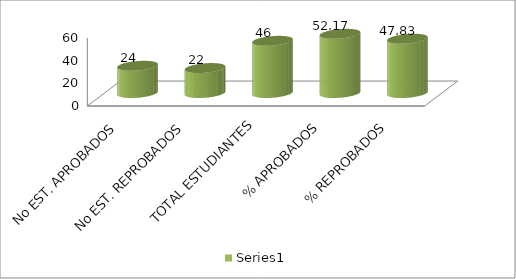
| Category | Series 0 |
|---|---|
| No EST. APROBADOS | 24 |
| No EST. REPROBADOS | 22 |
| TOTAL ESTUDIANTES | 46 |
| % APROBADOS | 52.174 |
| % REPROBADOS | 47.826 |